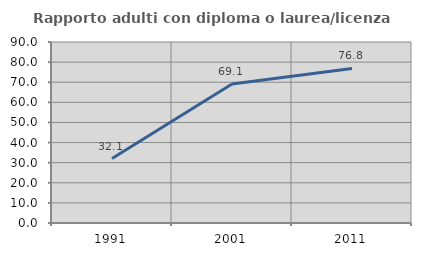
| Category | Rapporto adulti con diploma o laurea/licenza media  |
|---|---|
| 1991.0 | 32.051 |
| 2001.0 | 69.136 |
| 2011.0 | 76.842 |